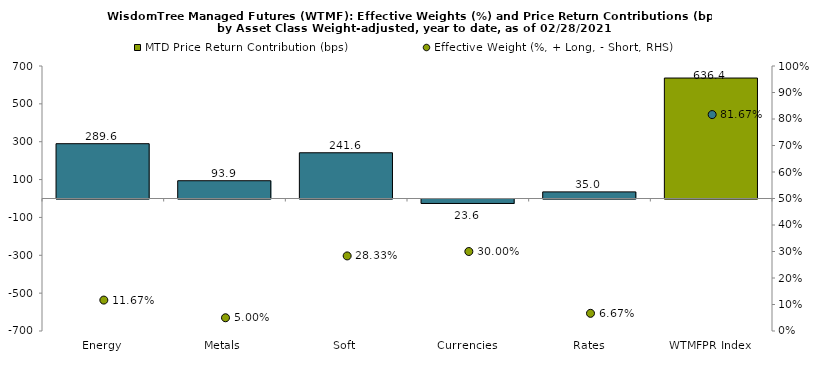
| Category | MTD Price Return Contribution (bps) |
|---|---|
| Energy | 289.561 |
| Metals | 93.87 |
| Soft | 241.557 |
| Currencies | -23.556 |
| Rates | 34.993 |
| WTMFPR Index | 636.425 |